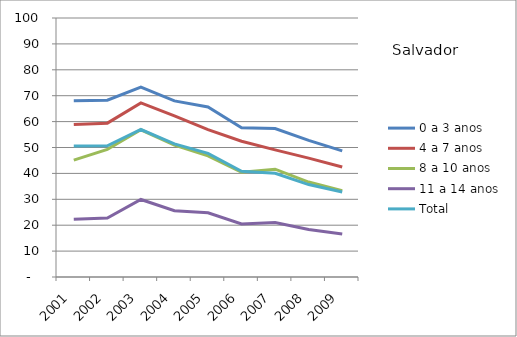
| Category | 0 a 3 anos | 4 a 7 anos | 8 a 10 anos | 11 a 14 anos | Total |
|---|---|---|---|---|---|
| 2001.0 | 68.01 | 58.84 | 45.15 | 22.25 | 50.54 |
| 2002.0 | 68.26 | 59.4 | 49.27 | 22.78 | 50.63 |
| 2003.0 | 73.34 | 67.23 | 56.84 | 29.94 | 56.95 |
| 2004.0 | 68.01 | 62.25 | 50.97 | 25.61 | 51.4 |
| 2005.0 | 65.64 | 56.89 | 46.75 | 24.79 | 47.71 |
| 2006.0 | 57.58 | 52.4 | 40.44 | 20.5 | 40.82 |
| 2007.0 | 57.32 | 49.07 | 41.62 | 21.03 | 40.03 |
| 2008.0 | 52.77 | 45.9 | 36.65 | 18.37 | 35.69 |
| 2009.0 | 48.72 | 42.46 | 33.36 | 16.62 | 32.84 |